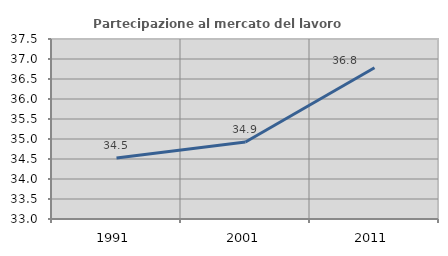
| Category | Partecipazione al mercato del lavoro  femminile |
|---|---|
| 1991.0 | 34.523 |
| 2001.0 | 34.924 |
| 2011.0 | 36.783 |